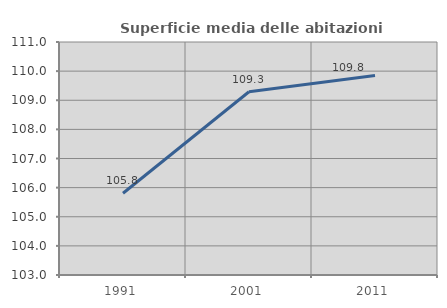
| Category | Superficie media delle abitazioni occupate |
|---|---|
| 1991.0 | 105.806 |
| 2001.0 | 109.293 |
| 2011.0 | 109.848 |